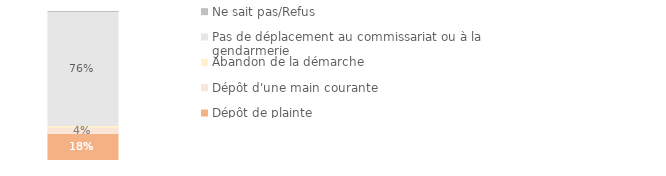
| Category | Dépôt de plainte | Dépôt d'une main courante | Abandon de la démarche | Pas de déplacement au commissariat ou à la gendarmerie | Ne sait pas/Refus |
|---|---|---|---|---|---|
| Ensemble des ménages victimes | 0.182 | 0.042 | 0.011 | 0.765 | 0.001 |